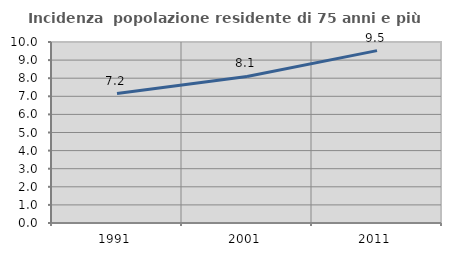
| Category | Incidenza  popolazione residente di 75 anni e più |
|---|---|
| 1991.0 | 7.154 |
| 2001.0 | 8.099 |
| 2011.0 | 9.524 |